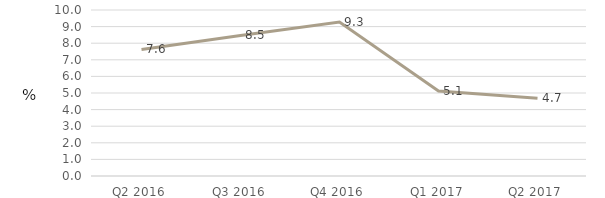
| Category | Activities of households as employers |
|---|---|
| Q2 2016 | 7.625 |
| Q3 2016 | 8.465 |
| Q4 2016 | 9.27 |
| Q1 2017 | 5.116 |
| Q2 2017 | 4.687 |